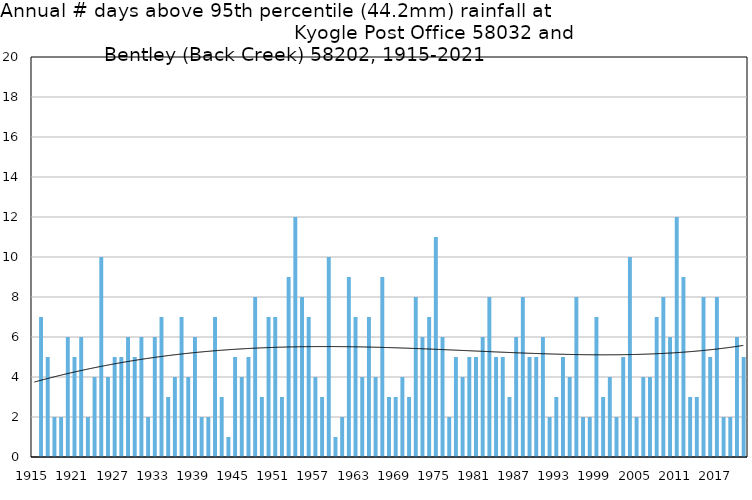
| Category | Annual # days above 95th percentile |
|---|---|
| 1915 | 0 |
| 1916 | 7 |
| 1917 | 5 |
| 1918 | 2 |
| 1919 | 2 |
| 1920 | 6 |
| 1921 | 5 |
| 1922 | 6 |
| 1923 | 2 |
| 1924 | 4 |
| 1925 | 10 |
| 1926 | 4 |
| 1927 | 5 |
| 1928 | 5 |
| 1929 | 6 |
| 1930 | 5 |
| 1931 | 6 |
| 1932 | 2 |
| 1933 | 6 |
| 1934 | 7 |
| 1935 | 3 |
| 1936 | 4 |
| 1937 | 7 |
| 1938 | 4 |
| 1939 | 6 |
| 1940 | 2 |
| 1941 | 2 |
| 1942 | 7 |
| 1943 | 3 |
| 1944 | 1 |
| 1945 | 5 |
| 1946 | 4 |
| 1947 | 5 |
| 1948 | 8 |
| 1949 | 3 |
| 1950 | 7 |
| 1951 | 7 |
| 1952 | 3 |
| 1953 | 9 |
| 1954 | 12 |
| 1955 | 8 |
| 1956 | 7 |
| 1957 | 4 |
| 1958 | 3 |
| 1959 | 10 |
| 1960 | 1 |
| 1961 | 2 |
| 1962 | 9 |
| 1963 | 7 |
| 1964 | 4 |
| 1965 | 7 |
| 1966 | 4 |
| 1967 | 9 |
| 1968 | 3 |
| 1969 | 3 |
| 1970 | 4 |
| 1971 | 3 |
| 1972 | 8 |
| 1973 | 6 |
| 1974 | 7 |
| 1975 | 11 |
| 1976 | 6 |
| 1977 | 2 |
| 1978 | 5 |
| 1979 | 4 |
| 1980 | 5 |
| 1981 | 5 |
| 1982 | 6 |
| 1983 | 8 |
| 1984 | 5 |
| 1985 | 5 |
| 1986 | 3 |
| 1987 | 6 |
| 1988 | 8 |
| 1989 | 5 |
| 1990 | 5 |
| 1991 | 6 |
| 1992 | 2 |
| 1993 | 3 |
| 1994 | 5 |
| 1995 | 4 |
| 1996 | 8 |
| 1997 | 2 |
| 1998 | 2 |
| 1999 | 7 |
| 2000 | 3 |
| 2001 | 4 |
| 2002 | 2 |
| 2003 | 5 |
| 2004 | 10 |
| 2005 | 2 |
| 2006 | 4 |
| 2007 | 4 |
| 2008 | 7 |
| 2009 | 8 |
| 2010 | 6 |
| 2011 | 12 |
| 2012 | 9 |
| 2013 | 3 |
| 2014 | 3 |
| 2015 | 8 |
| 2016 | 5 |
| 2017 | 8 |
| 2018 | 2 |
| 2019 | 2 |
| 2020 | 6 |
| 2021 | 5 |